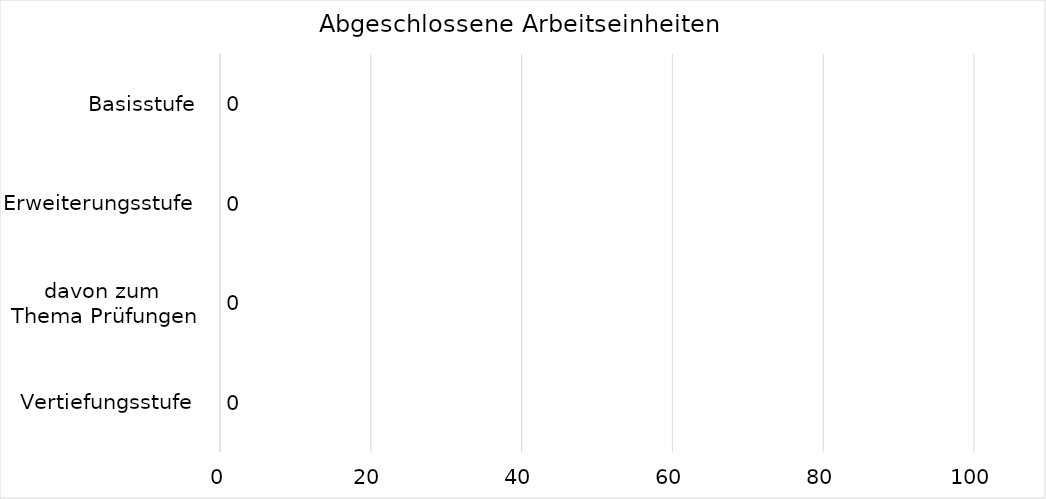
| Category | Series 0 |
|---|---|
| Vertiefungsstufe | 0 |
| davon zum 
Thema Prüfungen | 0 |
| Erweiterungsstufe | 0 |
| Basisstufe | 0 |